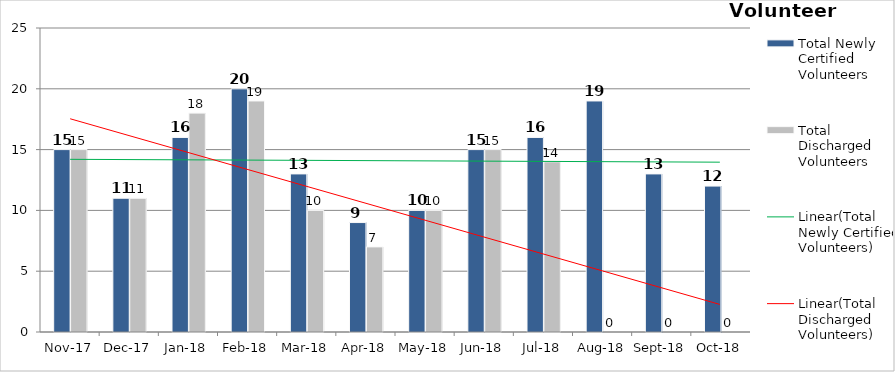
| Category | Total Newly Certified Volunteers | Total Discharged Volunteers |
|---|---|---|
| 2017-11-01 | 15 | 15 |
| 2017-12-01 | 11 | 11 |
| 2018-01-01 | 16 | 18 |
| 2018-02-01 | 20 | 19 |
| 2018-03-01 | 13 | 10 |
| 2018-04-01 | 9 | 7 |
| 2018-05-01 | 10 | 10 |
| 2018-06-01 | 15 | 15 |
| 2018-07-01 | 16 | 14 |
| 2018-08-01 | 19 | 0 |
| 2018-09-01 | 13 | 0 |
| 2018-10-01 | 12 | 0 |